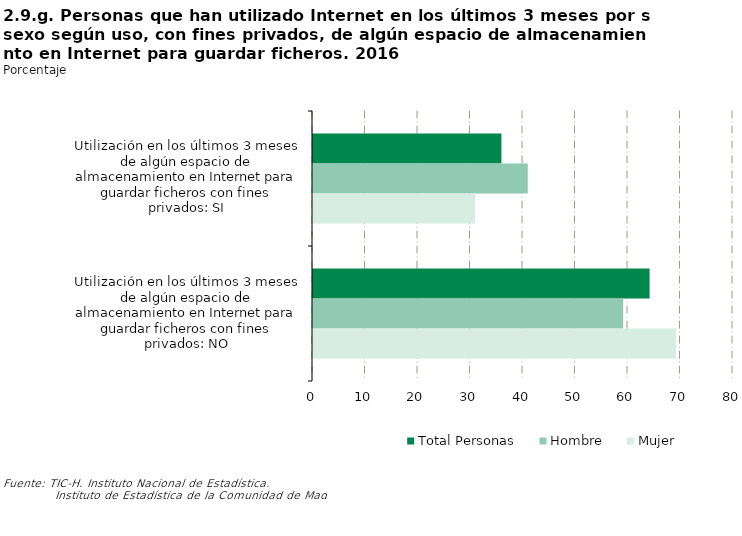
| Category | Total Personas | Hombre | Mujer |
|---|---|---|---|
| Utilización en los últimos 3 meses de algún espacio de almacenamiento en Internet para guardar ficheros con fines privados: SI | 35.889 | 40.913 | 30.848 |
| Utilización en los últimos 3 meses de algún espacio de almacenamiento en Internet para guardar ficheros con fines privados: NO | 64.111 | 59.087 | 69.152 |